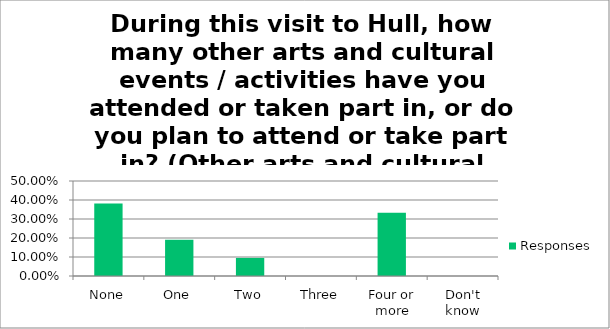
| Category | Responses |
|---|---|
| None | 0.381 |
| One | 0.19 |
| Two | 0.095 |
| Three | 0 |
| Four or more | 0.333 |
| Don't know | 0 |